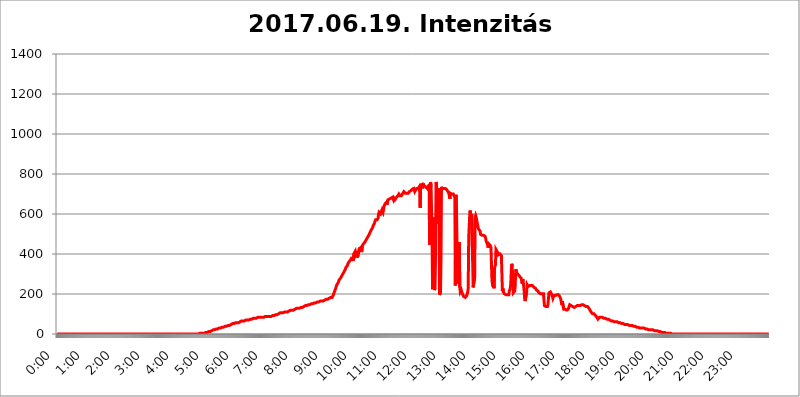
| Category | 2017.06.19. Intenzitás [W/m^2] |
|---|---|
| 0.0 | 0 |
| 0.0006944444444444445 | 0 |
| 0.001388888888888889 | 0 |
| 0.0020833333333333333 | 0 |
| 0.002777777777777778 | 0 |
| 0.003472222222222222 | 0 |
| 0.004166666666666667 | 0 |
| 0.004861111111111111 | 0 |
| 0.005555555555555556 | 0 |
| 0.0062499999999999995 | 0 |
| 0.006944444444444444 | 0 |
| 0.007638888888888889 | 0 |
| 0.008333333333333333 | 0 |
| 0.009027777777777779 | 0 |
| 0.009722222222222222 | 0 |
| 0.010416666666666666 | 0 |
| 0.011111111111111112 | 0 |
| 0.011805555555555555 | 0 |
| 0.012499999999999999 | 0 |
| 0.013194444444444444 | 0 |
| 0.013888888888888888 | 0 |
| 0.014583333333333332 | 0 |
| 0.015277777777777777 | 0 |
| 0.015972222222222224 | 0 |
| 0.016666666666666666 | 0 |
| 0.017361111111111112 | 0 |
| 0.018055555555555557 | 0 |
| 0.01875 | 0 |
| 0.019444444444444445 | 0 |
| 0.02013888888888889 | 0 |
| 0.020833333333333332 | 0 |
| 0.02152777777777778 | 0 |
| 0.022222222222222223 | 0 |
| 0.02291666666666667 | 0 |
| 0.02361111111111111 | 0 |
| 0.024305555555555556 | 0 |
| 0.024999999999999998 | 0 |
| 0.025694444444444447 | 0 |
| 0.02638888888888889 | 0 |
| 0.027083333333333334 | 0 |
| 0.027777777777777776 | 0 |
| 0.02847222222222222 | 0 |
| 0.029166666666666664 | 0 |
| 0.029861111111111113 | 0 |
| 0.030555555555555555 | 0 |
| 0.03125 | 0 |
| 0.03194444444444445 | 0 |
| 0.03263888888888889 | 0 |
| 0.03333333333333333 | 0 |
| 0.034027777777777775 | 0 |
| 0.034722222222222224 | 0 |
| 0.035416666666666666 | 0 |
| 0.036111111111111115 | 0 |
| 0.03680555555555556 | 0 |
| 0.0375 | 0 |
| 0.03819444444444444 | 0 |
| 0.03888888888888889 | 0 |
| 0.03958333333333333 | 0 |
| 0.04027777777777778 | 0 |
| 0.04097222222222222 | 0 |
| 0.041666666666666664 | 0 |
| 0.042361111111111106 | 0 |
| 0.04305555555555556 | 0 |
| 0.043750000000000004 | 0 |
| 0.044444444444444446 | 0 |
| 0.04513888888888889 | 0 |
| 0.04583333333333334 | 0 |
| 0.04652777777777778 | 0 |
| 0.04722222222222222 | 0 |
| 0.04791666666666666 | 0 |
| 0.04861111111111111 | 0 |
| 0.049305555555555554 | 0 |
| 0.049999999999999996 | 0 |
| 0.05069444444444445 | 0 |
| 0.051388888888888894 | 0 |
| 0.052083333333333336 | 0 |
| 0.05277777777777778 | 0 |
| 0.05347222222222222 | 0 |
| 0.05416666666666667 | 0 |
| 0.05486111111111111 | 0 |
| 0.05555555555555555 | 0 |
| 0.05625 | 0 |
| 0.05694444444444444 | 0 |
| 0.057638888888888885 | 0 |
| 0.05833333333333333 | 0 |
| 0.05902777777777778 | 0 |
| 0.059722222222222225 | 0 |
| 0.06041666666666667 | 0 |
| 0.061111111111111116 | 0 |
| 0.06180555555555556 | 0 |
| 0.0625 | 0 |
| 0.06319444444444444 | 0 |
| 0.06388888888888888 | 0 |
| 0.06458333333333334 | 0 |
| 0.06527777777777778 | 0 |
| 0.06597222222222222 | 0 |
| 0.06666666666666667 | 0 |
| 0.06736111111111111 | 0 |
| 0.06805555555555555 | 0 |
| 0.06874999999999999 | 0 |
| 0.06944444444444443 | 0 |
| 0.07013888888888889 | 0 |
| 0.07083333333333333 | 0 |
| 0.07152777777777779 | 0 |
| 0.07222222222222223 | 0 |
| 0.07291666666666667 | 0 |
| 0.07361111111111111 | 0 |
| 0.07430555555555556 | 0 |
| 0.075 | 0 |
| 0.07569444444444444 | 0 |
| 0.0763888888888889 | 0 |
| 0.07708333333333334 | 0 |
| 0.07777777777777778 | 0 |
| 0.07847222222222222 | 0 |
| 0.07916666666666666 | 0 |
| 0.0798611111111111 | 0 |
| 0.08055555555555556 | 0 |
| 0.08125 | 0 |
| 0.08194444444444444 | 0 |
| 0.08263888888888889 | 0 |
| 0.08333333333333333 | 0 |
| 0.08402777777777777 | 0 |
| 0.08472222222222221 | 0 |
| 0.08541666666666665 | 0 |
| 0.08611111111111112 | 0 |
| 0.08680555555555557 | 0 |
| 0.08750000000000001 | 0 |
| 0.08819444444444445 | 0 |
| 0.08888888888888889 | 0 |
| 0.08958333333333333 | 0 |
| 0.09027777777777778 | 0 |
| 0.09097222222222222 | 0 |
| 0.09166666666666667 | 0 |
| 0.09236111111111112 | 0 |
| 0.09305555555555556 | 0 |
| 0.09375 | 0 |
| 0.09444444444444444 | 0 |
| 0.09513888888888888 | 0 |
| 0.09583333333333333 | 0 |
| 0.09652777777777777 | 0 |
| 0.09722222222222222 | 0 |
| 0.09791666666666667 | 0 |
| 0.09861111111111111 | 0 |
| 0.09930555555555555 | 0 |
| 0.09999999999999999 | 0 |
| 0.10069444444444443 | 0 |
| 0.1013888888888889 | 0 |
| 0.10208333333333335 | 0 |
| 0.10277777777777779 | 0 |
| 0.10347222222222223 | 0 |
| 0.10416666666666667 | 0 |
| 0.10486111111111111 | 0 |
| 0.10555555555555556 | 0 |
| 0.10625 | 0 |
| 0.10694444444444444 | 0 |
| 0.1076388888888889 | 0 |
| 0.10833333333333334 | 0 |
| 0.10902777777777778 | 0 |
| 0.10972222222222222 | 0 |
| 0.1111111111111111 | 0 |
| 0.11180555555555556 | 0 |
| 0.11180555555555556 | 0 |
| 0.1125 | 0 |
| 0.11319444444444444 | 0 |
| 0.11388888888888889 | 0 |
| 0.11458333333333333 | 0 |
| 0.11527777777777777 | 0 |
| 0.11597222222222221 | 0 |
| 0.11666666666666665 | 0 |
| 0.1173611111111111 | 0 |
| 0.11805555555555557 | 0 |
| 0.11944444444444445 | 0 |
| 0.12013888888888889 | 0 |
| 0.12083333333333333 | 0 |
| 0.12152777777777778 | 0 |
| 0.12222222222222223 | 0 |
| 0.12291666666666667 | 0 |
| 0.12291666666666667 | 0 |
| 0.12361111111111112 | 0 |
| 0.12430555555555556 | 0 |
| 0.125 | 0 |
| 0.12569444444444444 | 0 |
| 0.12638888888888888 | 0 |
| 0.12708333333333333 | 0 |
| 0.16875 | 0 |
| 0.12847222222222224 | 0 |
| 0.12916666666666668 | 0 |
| 0.12986111111111112 | 0 |
| 0.13055555555555556 | 0 |
| 0.13125 | 0 |
| 0.13194444444444445 | 0 |
| 0.1326388888888889 | 0 |
| 0.13333333333333333 | 0 |
| 0.13402777777777777 | 0 |
| 0.13402777777777777 | 0 |
| 0.13472222222222222 | 0 |
| 0.13541666666666666 | 0 |
| 0.1361111111111111 | 0 |
| 0.13749999999999998 | 0 |
| 0.13819444444444443 | 0 |
| 0.1388888888888889 | 0 |
| 0.13958333333333334 | 0 |
| 0.14027777777777778 | 0 |
| 0.14097222222222222 | 0 |
| 0.14166666666666666 | 0 |
| 0.1423611111111111 | 0 |
| 0.14305555555555557 | 0 |
| 0.14375000000000002 | 0 |
| 0.14444444444444446 | 0 |
| 0.1451388888888889 | 0 |
| 0.1451388888888889 | 0 |
| 0.14652777777777778 | 0 |
| 0.14722222222222223 | 0 |
| 0.14791666666666667 | 0 |
| 0.1486111111111111 | 0 |
| 0.14930555555555555 | 0 |
| 0.15 | 0 |
| 0.15069444444444444 | 0 |
| 0.15138888888888888 | 0 |
| 0.15208333333333332 | 0 |
| 0.15277777777777776 | 0 |
| 0.15347222222222223 | 0 |
| 0.15416666666666667 | 0 |
| 0.15486111111111112 | 0 |
| 0.15555555555555556 | 0 |
| 0.15625 | 0 |
| 0.15694444444444444 | 0 |
| 0.15763888888888888 | 0 |
| 0.15833333333333333 | 0 |
| 0.15902777777777777 | 0 |
| 0.15972222222222224 | 0 |
| 0.16041666666666668 | 0 |
| 0.16111111111111112 | 0 |
| 0.16180555555555556 | 0 |
| 0.1625 | 0 |
| 0.16319444444444445 | 0 |
| 0.1638888888888889 | 0 |
| 0.16458333333333333 | 0 |
| 0.16527777777777777 | 0 |
| 0.16597222222222222 | 0 |
| 0.16666666666666666 | 0 |
| 0.1673611111111111 | 0 |
| 0.16805555555555554 | 0 |
| 0.16874999999999998 | 0 |
| 0.16944444444444443 | 0 |
| 0.17013888888888887 | 0 |
| 0.1708333333333333 | 0 |
| 0.17152777777777775 | 0 |
| 0.17222222222222225 | 0 |
| 0.1729166666666667 | 0 |
| 0.17361111111111113 | 0 |
| 0.17430555555555557 | 0 |
| 0.17500000000000002 | 0 |
| 0.17569444444444446 | 0 |
| 0.1763888888888889 | 0 |
| 0.17708333333333334 | 0 |
| 0.17777777777777778 | 0 |
| 0.17847222222222223 | 0 |
| 0.17916666666666667 | 0 |
| 0.1798611111111111 | 0 |
| 0.18055555555555555 | 0 |
| 0.18125 | 0 |
| 0.18194444444444444 | 0 |
| 0.1826388888888889 | 0 |
| 0.18333333333333335 | 0 |
| 0.1840277777777778 | 0 |
| 0.18472222222222223 | 0 |
| 0.18541666666666667 | 0 |
| 0.18611111111111112 | 0 |
| 0.18680555555555556 | 0 |
| 0.1875 | 0 |
| 0.18819444444444444 | 0 |
| 0.18888888888888888 | 0 |
| 0.18958333333333333 | 0 |
| 0.19027777777777777 | 0 |
| 0.1909722222222222 | 0 |
| 0.19166666666666665 | 0 |
| 0.19236111111111112 | 0 |
| 0.19305555555555554 | 0 |
| 0.19375 | 0 |
| 0.19444444444444445 | 0 |
| 0.1951388888888889 | 0 |
| 0.19583333333333333 | 0 |
| 0.19652777777777777 | 0 |
| 0.19722222222222222 | 0 |
| 0.19791666666666666 | 0 |
| 0.1986111111111111 | 0 |
| 0.19930555555555554 | 3.525 |
| 0.19999999999999998 | 3.525 |
| 0.20069444444444443 | 3.525 |
| 0.20138888888888887 | 3.525 |
| 0.2020833333333333 | 3.525 |
| 0.2027777777777778 | 3.525 |
| 0.2034722222222222 | 3.525 |
| 0.2041666666666667 | 3.525 |
| 0.20486111111111113 | 3.525 |
| 0.20555555555555557 | 3.525 |
| 0.20625000000000002 | 3.525 |
| 0.20694444444444446 | 3.525 |
| 0.2076388888888889 | 7.887 |
| 0.20833333333333334 | 7.887 |
| 0.20902777777777778 | 7.887 |
| 0.20972222222222223 | 7.887 |
| 0.21041666666666667 | 7.887 |
| 0.2111111111111111 | 7.887 |
| 0.21180555555555555 | 7.887 |
| 0.2125 | 12.257 |
| 0.21319444444444444 | 12.257 |
| 0.2138888888888889 | 12.257 |
| 0.21458333333333335 | 12.257 |
| 0.2152777777777778 | 16.636 |
| 0.21597222222222223 | 16.636 |
| 0.21666666666666667 | 16.636 |
| 0.21736111111111112 | 16.636 |
| 0.21805555555555556 | 21.024 |
| 0.21875 | 21.024 |
| 0.21944444444444444 | 21.024 |
| 0.22013888888888888 | 21.024 |
| 0.22083333333333333 | 21.024 |
| 0.22152777777777777 | 21.024 |
| 0.2222222222222222 | 21.024 |
| 0.22291666666666665 | 25.419 |
| 0.2236111111111111 | 25.419 |
| 0.22430555555555556 | 25.419 |
| 0.225 | 25.419 |
| 0.22569444444444445 | 29.823 |
| 0.2263888888888889 | 29.823 |
| 0.22708333333333333 | 29.823 |
| 0.22777777777777777 | 29.823 |
| 0.22847222222222222 | 29.823 |
| 0.22916666666666666 | 29.823 |
| 0.2298611111111111 | 29.823 |
| 0.23055555555555554 | 29.823 |
| 0.23124999999999998 | 34.234 |
| 0.23194444444444443 | 34.234 |
| 0.23263888888888887 | 34.234 |
| 0.2333333333333333 | 34.234 |
| 0.2340277777777778 | 34.234 |
| 0.2347222222222222 | 38.653 |
| 0.2354166666666667 | 38.653 |
| 0.23611111111111113 | 38.653 |
| 0.23680555555555557 | 38.653 |
| 0.23750000000000002 | 38.653 |
| 0.23819444444444446 | 38.653 |
| 0.2388888888888889 | 43.079 |
| 0.23958333333333334 | 43.079 |
| 0.24027777777777778 | 43.079 |
| 0.24097222222222223 | 43.079 |
| 0.24166666666666667 | 43.079 |
| 0.2423611111111111 | 47.511 |
| 0.24305555555555555 | 47.511 |
| 0.24375 | 47.511 |
| 0.24444444444444446 | 47.511 |
| 0.24513888888888888 | 47.511 |
| 0.24583333333333335 | 51.951 |
| 0.2465277777777778 | 51.951 |
| 0.24722222222222223 | 51.951 |
| 0.24791666666666667 | 51.951 |
| 0.24861111111111112 | 51.951 |
| 0.24930555555555556 | 56.398 |
| 0.25 | 56.398 |
| 0.25069444444444444 | 56.398 |
| 0.2513888888888889 | 56.398 |
| 0.2520833333333333 | 56.398 |
| 0.25277777777777777 | 56.398 |
| 0.2534722222222222 | 56.398 |
| 0.25416666666666665 | 56.398 |
| 0.2548611111111111 | 60.85 |
| 0.2555555555555556 | 60.85 |
| 0.25625000000000003 | 60.85 |
| 0.2569444444444445 | 60.85 |
| 0.2576388888888889 | 60.85 |
| 0.25833333333333336 | 65.31 |
| 0.2590277777777778 | 65.31 |
| 0.25972222222222224 | 65.31 |
| 0.2604166666666667 | 65.31 |
| 0.2611111111111111 | 65.31 |
| 0.26180555555555557 | 65.31 |
| 0.2625 | 65.31 |
| 0.26319444444444445 | 65.31 |
| 0.2638888888888889 | 69.775 |
| 0.26458333333333334 | 69.775 |
| 0.2652777777777778 | 69.775 |
| 0.2659722222222222 | 69.775 |
| 0.26666666666666666 | 69.775 |
| 0.2673611111111111 | 69.775 |
| 0.26805555555555555 | 69.775 |
| 0.26875 | 69.775 |
| 0.26944444444444443 | 69.775 |
| 0.2701388888888889 | 74.246 |
| 0.2708333333333333 | 74.246 |
| 0.27152777777777776 | 74.246 |
| 0.2722222222222222 | 74.246 |
| 0.27291666666666664 | 74.246 |
| 0.2736111111111111 | 74.246 |
| 0.2743055555555555 | 74.246 |
| 0.27499999999999997 | 78.722 |
| 0.27569444444444446 | 78.722 |
| 0.27638888888888885 | 78.722 |
| 0.27708333333333335 | 78.722 |
| 0.2777777777777778 | 78.722 |
| 0.27847222222222223 | 78.722 |
| 0.2791666666666667 | 78.722 |
| 0.2798611111111111 | 78.722 |
| 0.28055555555555556 | 83.205 |
| 0.28125 | 83.205 |
| 0.28194444444444444 | 83.205 |
| 0.2826388888888889 | 83.205 |
| 0.2833333333333333 | 83.205 |
| 0.28402777777777777 | 83.205 |
| 0.2847222222222222 | 83.205 |
| 0.28541666666666665 | 83.205 |
| 0.28611111111111115 | 83.205 |
| 0.28680555555555554 | 83.205 |
| 0.28750000000000003 | 83.205 |
| 0.2881944444444445 | 83.205 |
| 0.2888888888888889 | 83.205 |
| 0.28958333333333336 | 83.205 |
| 0.2902777777777778 | 87.692 |
| 0.29097222222222224 | 87.692 |
| 0.2916666666666667 | 87.692 |
| 0.2923611111111111 | 87.692 |
| 0.29305555555555557 | 87.692 |
| 0.29375 | 87.692 |
| 0.29444444444444445 | 87.692 |
| 0.2951388888888889 | 87.692 |
| 0.29583333333333334 | 87.692 |
| 0.2965277777777778 | 87.692 |
| 0.2972222222222222 | 87.692 |
| 0.29791666666666666 | 87.692 |
| 0.2986111111111111 | 87.692 |
| 0.29930555555555555 | 87.692 |
| 0.3 | 87.692 |
| 0.30069444444444443 | 87.692 |
| 0.3013888888888889 | 92.184 |
| 0.3020833333333333 | 92.184 |
| 0.30277777777777776 | 92.184 |
| 0.3034722222222222 | 92.184 |
| 0.30416666666666664 | 92.184 |
| 0.3048611111111111 | 96.682 |
| 0.3055555555555555 | 96.682 |
| 0.30624999999999997 | 96.682 |
| 0.3069444444444444 | 96.682 |
| 0.3076388888888889 | 96.682 |
| 0.30833333333333335 | 96.682 |
| 0.3090277777777778 | 101.184 |
| 0.30972222222222223 | 101.184 |
| 0.3104166666666667 | 101.184 |
| 0.3111111111111111 | 101.184 |
| 0.31180555555555556 | 101.184 |
| 0.3125 | 105.69 |
| 0.31319444444444444 | 105.69 |
| 0.3138888888888889 | 101.184 |
| 0.3145833333333333 | 105.69 |
| 0.31527777777777777 | 105.69 |
| 0.3159722222222222 | 105.69 |
| 0.31666666666666665 | 105.69 |
| 0.31736111111111115 | 110.201 |
| 0.31805555555555554 | 110.201 |
| 0.31875000000000003 | 110.201 |
| 0.3194444444444445 | 110.201 |
| 0.3201388888888889 | 110.201 |
| 0.32083333333333336 | 110.201 |
| 0.3215277777777778 | 110.201 |
| 0.32222222222222224 | 110.201 |
| 0.3229166666666667 | 110.201 |
| 0.3236111111111111 | 110.201 |
| 0.32430555555555557 | 114.716 |
| 0.325 | 114.716 |
| 0.32569444444444445 | 114.716 |
| 0.3263888888888889 | 114.716 |
| 0.32708333333333334 | 119.235 |
| 0.3277777777777778 | 119.235 |
| 0.3284722222222222 | 119.235 |
| 0.32916666666666666 | 119.235 |
| 0.3298611111111111 | 119.235 |
| 0.33055555555555555 | 119.235 |
| 0.33125 | 119.235 |
| 0.33194444444444443 | 123.758 |
| 0.3326388888888889 | 123.758 |
| 0.3333333333333333 | 123.758 |
| 0.3340277777777778 | 123.758 |
| 0.3347222222222222 | 123.758 |
| 0.3354166666666667 | 128.284 |
| 0.3361111111111111 | 128.284 |
| 0.3368055555555556 | 128.284 |
| 0.33749999999999997 | 128.284 |
| 0.33819444444444446 | 128.284 |
| 0.33888888888888885 | 128.284 |
| 0.33958333333333335 | 128.284 |
| 0.34027777777777773 | 132.814 |
| 0.34097222222222223 | 132.814 |
| 0.3416666666666666 | 132.814 |
| 0.3423611111111111 | 132.814 |
| 0.3430555555555555 | 132.814 |
| 0.34375 | 132.814 |
| 0.3444444444444445 | 137.347 |
| 0.3451388888888889 | 137.347 |
| 0.3458333333333334 | 137.347 |
| 0.34652777777777777 | 137.347 |
| 0.34722222222222227 | 137.347 |
| 0.34791666666666665 | 141.884 |
| 0.34861111111111115 | 141.884 |
| 0.34930555555555554 | 141.884 |
| 0.35000000000000003 | 141.884 |
| 0.3506944444444444 | 141.884 |
| 0.3513888888888889 | 146.423 |
| 0.3520833333333333 | 146.423 |
| 0.3527777777777778 | 146.423 |
| 0.3534722222222222 | 146.423 |
| 0.3541666666666667 | 146.423 |
| 0.3548611111111111 | 146.423 |
| 0.35555555555555557 | 146.423 |
| 0.35625 | 150.964 |
| 0.35694444444444445 | 150.964 |
| 0.3576388888888889 | 150.964 |
| 0.35833333333333334 | 150.964 |
| 0.3590277777777778 | 155.509 |
| 0.3597222222222222 | 155.509 |
| 0.36041666666666666 | 155.509 |
| 0.3611111111111111 | 155.509 |
| 0.36180555555555555 | 155.509 |
| 0.3625 | 155.509 |
| 0.36319444444444443 | 155.509 |
| 0.3638888888888889 | 160.056 |
| 0.3645833333333333 | 160.056 |
| 0.3652777777777778 | 160.056 |
| 0.3659722222222222 | 160.056 |
| 0.3666666666666667 | 160.056 |
| 0.3673611111111111 | 155.509 |
| 0.3680555555555556 | 164.605 |
| 0.36874999999999997 | 164.605 |
| 0.36944444444444446 | 164.605 |
| 0.37013888888888885 | 164.605 |
| 0.37083333333333335 | 164.605 |
| 0.37152777777777773 | 164.605 |
| 0.37222222222222223 | 169.156 |
| 0.3729166666666666 | 164.605 |
| 0.3736111111111111 | 164.605 |
| 0.3743055555555555 | 169.156 |
| 0.375 | 169.156 |
| 0.3756944444444445 | 173.709 |
| 0.3763888888888889 | 173.709 |
| 0.3770833333333334 | 173.709 |
| 0.37777777777777777 | 173.709 |
| 0.37847222222222227 | 173.709 |
| 0.37916666666666665 | 173.709 |
| 0.37986111111111115 | 173.709 |
| 0.38055555555555554 | 178.264 |
| 0.38125000000000003 | 178.264 |
| 0.3819444444444444 | 178.264 |
| 0.3826388888888889 | 178.264 |
| 0.3833333333333333 | 182.82 |
| 0.3840277777777778 | 182.82 |
| 0.3847222222222222 | 182.82 |
| 0.3854166666666667 | 182.82 |
| 0.3861111111111111 | 187.378 |
| 0.38680555555555557 | 191.937 |
| 0.3875 | 196.497 |
| 0.38819444444444445 | 205.62 |
| 0.3888888888888889 | 210.182 |
| 0.38958333333333334 | 219.309 |
| 0.3902777777777778 | 223.873 |
| 0.3909722222222222 | 233 |
| 0.39166666666666666 | 242.127 |
| 0.3923611111111111 | 246.689 |
| 0.39305555555555555 | 251.251 |
| 0.39375 | 255.813 |
| 0.39444444444444443 | 260.373 |
| 0.3951388888888889 | 269.49 |
| 0.3958333333333333 | 269.49 |
| 0.3965277777777778 | 274.047 |
| 0.3972222222222222 | 278.603 |
| 0.3979166666666667 | 283.156 |
| 0.3986111111111111 | 287.709 |
| 0.3993055555555556 | 292.259 |
| 0.39999999999999997 | 296.808 |
| 0.40069444444444446 | 301.354 |
| 0.40138888888888885 | 305.898 |
| 0.40208333333333335 | 310.44 |
| 0.40277777777777773 | 314.98 |
| 0.40347222222222223 | 319.517 |
| 0.4041666666666666 | 324.052 |
| 0.4048611111111111 | 333.113 |
| 0.4055555555555555 | 333.113 |
| 0.40625 | 337.639 |
| 0.4069444444444445 | 342.162 |
| 0.4076388888888889 | 351.198 |
| 0.4083333333333334 | 351.198 |
| 0.40902777777777777 | 360.221 |
| 0.40972222222222227 | 360.221 |
| 0.41041666666666665 | 364.728 |
| 0.41111111111111115 | 369.23 |
| 0.41180555555555554 | 373.729 |
| 0.41250000000000003 | 378.224 |
| 0.4131944444444444 | 378.224 |
| 0.4138888888888889 | 382.715 |
| 0.4145833333333333 | 373.729 |
| 0.4152777777777778 | 364.728 |
| 0.4159722222222222 | 400.638 |
| 0.4166666666666667 | 400.638 |
| 0.4173611111111111 | 405.108 |
| 0.41805555555555557 | 414.035 |
| 0.41875 | 400.638 |
| 0.41944444444444445 | 405.108 |
| 0.4201388888888889 | 414.035 |
| 0.42083333333333334 | 382.715 |
| 0.4215277777777778 | 382.715 |
| 0.4222222222222222 | 396.164 |
| 0.42291666666666666 | 418.492 |
| 0.4236111111111111 | 427.39 |
| 0.42430555555555555 | 431.833 |
| 0.425 | 431.833 |
| 0.42569444444444443 | 431.833 |
| 0.4263888888888889 | 418.492 |
| 0.4270833333333333 | 409.574 |
| 0.4277777777777778 | 440.702 |
| 0.4284722222222222 | 445.129 |
| 0.4291666666666667 | 449.551 |
| 0.4298611111111111 | 453.968 |
| 0.4305555555555556 | 453.968 |
| 0.43124999999999997 | 458.38 |
| 0.43194444444444446 | 458.38 |
| 0.43263888888888885 | 467.187 |
| 0.43333333333333335 | 471.582 |
| 0.43402777777777773 | 475.972 |
| 0.43472222222222223 | 480.356 |
| 0.4354166666666666 | 484.735 |
| 0.4361111111111111 | 489.108 |
| 0.4368055555555555 | 489.108 |
| 0.4375 | 497.836 |
| 0.4381944444444445 | 502.192 |
| 0.4388888888888889 | 502.192 |
| 0.4395833333333334 | 515.223 |
| 0.44027777777777777 | 519.555 |
| 0.44097222222222227 | 523.88 |
| 0.44166666666666665 | 528.2 |
| 0.44236111111111115 | 532.513 |
| 0.44305555555555554 | 541.121 |
| 0.44375000000000003 | 545.416 |
| 0.4444444444444444 | 549.704 |
| 0.4451388888888889 | 558.261 |
| 0.4458333333333333 | 562.53 |
| 0.4465277777777778 | 571.049 |
| 0.4472222222222222 | 575.299 |
| 0.4479166666666667 | 571.049 |
| 0.4486111111111111 | 571.049 |
| 0.44930555555555557 | 575.299 |
| 0.45 | 579.542 |
| 0.45069444444444445 | 600.661 |
| 0.4513888888888889 | 609.062 |
| 0.45208333333333334 | 609.062 |
| 0.4527777777777778 | 604.864 |
| 0.4534722222222222 | 600.661 |
| 0.45416666666666666 | 609.062 |
| 0.4548611111111111 | 613.252 |
| 0.45555555555555555 | 621.613 |
| 0.45625 | 617.436 |
| 0.45694444444444443 | 609.062 |
| 0.4576388888888889 | 621.613 |
| 0.4583333333333333 | 638.256 |
| 0.4590277777777778 | 642.4 |
| 0.4597222222222222 | 650.667 |
| 0.4604166666666667 | 646.537 |
| 0.4611111111111111 | 646.537 |
| 0.4618055555555556 | 658.909 |
| 0.46249999999999997 | 646.537 |
| 0.46319444444444446 | 658.909 |
| 0.46388888888888885 | 671.22 |
| 0.46458333333333335 | 675.311 |
| 0.46527777777777773 | 675.311 |
| 0.46597222222222223 | 675.311 |
| 0.4666666666666666 | 671.22 |
| 0.4673611111111111 | 675.311 |
| 0.4680555555555555 | 679.395 |
| 0.46875 | 679.395 |
| 0.4694444444444445 | 683.473 |
| 0.4701388888888889 | 683.473 |
| 0.4708333333333334 | 683.473 |
| 0.47152777777777777 | 671.22 |
| 0.47222222222222227 | 679.395 |
| 0.47291666666666665 | 675.311 |
| 0.47361111111111115 | 671.22 |
| 0.47430555555555554 | 675.311 |
| 0.47500000000000003 | 675.311 |
| 0.4756944444444444 | 683.473 |
| 0.4763888888888889 | 683.473 |
| 0.4770833333333333 | 687.544 |
| 0.4777777777777778 | 691.608 |
| 0.4784722222222222 | 695.666 |
| 0.4791666666666667 | 699.717 |
| 0.4798611111111111 | 695.666 |
| 0.48055555555555557 | 691.608 |
| 0.48125 | 691.608 |
| 0.48194444444444445 | 687.544 |
| 0.4826388888888889 | 691.608 |
| 0.48333333333333334 | 695.666 |
| 0.4840277777777778 | 699.717 |
| 0.4847222222222222 | 699.717 |
| 0.48541666666666666 | 699.717 |
| 0.4861111111111111 | 711.832 |
| 0.48680555555555555 | 707.8 |
| 0.4875 | 707.8 |
| 0.48819444444444443 | 703.762 |
| 0.4888888888888889 | 703.762 |
| 0.4895833333333333 | 707.8 |
| 0.4902777777777778 | 703.762 |
| 0.4909722222222222 | 707.8 |
| 0.4916666666666667 | 703.762 |
| 0.4923611111111111 | 703.762 |
| 0.4930555555555556 | 707.8 |
| 0.49374999999999997 | 711.832 |
| 0.49444444444444446 | 711.832 |
| 0.49513888888888885 | 711.832 |
| 0.49583333333333335 | 715.858 |
| 0.49652777777777773 | 719.877 |
| 0.49722222222222223 | 719.877 |
| 0.4979166666666666 | 723.889 |
| 0.4986111111111111 | 727.896 |
| 0.4993055555555555 | 727.896 |
| 0.5 | 727.896 |
| 0.5006944444444444 | 719.877 |
| 0.5013888888888889 | 711.832 |
| 0.5020833333333333 | 715.858 |
| 0.5027777777777778 | 719.877 |
| 0.5034722222222222 | 723.889 |
| 0.5041666666666667 | 727.896 |
| 0.5048611111111111 | 723.889 |
| 0.5055555555555555 | 727.896 |
| 0.50625 | 727.896 |
| 0.5069444444444444 | 723.889 |
| 0.5076388888888889 | 735.89 |
| 0.5083333333333333 | 707.8 |
| 0.5090277777777777 | 629.948 |
| 0.5097222222222222 | 743.859 |
| 0.5104166666666666 | 747.834 |
| 0.5111111111111112 | 743.859 |
| 0.5118055555555555 | 747.834 |
| 0.5125000000000001 | 727.896 |
| 0.5131944444444444 | 751.803 |
| 0.513888888888889 | 747.834 |
| 0.5145833333333333 | 739.877 |
| 0.5152777777777778 | 735.89 |
| 0.5159722222222222 | 735.89 |
| 0.5166666666666667 | 735.89 |
| 0.517361111111111 | 735.89 |
| 0.5180555555555556 | 731.896 |
| 0.5187499999999999 | 727.896 |
| 0.5194444444444445 | 735.89 |
| 0.5201388888888888 | 739.877 |
| 0.5208333333333334 | 739.877 |
| 0.5215277777777778 | 743.859 |
| 0.5222222222222223 | 445.129 |
| 0.5229166666666667 | 497.836 |
| 0.5236111111111111 | 759.723 |
| 0.5243055555555556 | 739.877 |
| 0.525 | 743.859 |
| 0.5256944444444445 | 480.356 |
| 0.5263888888888889 | 223.873 |
| 0.5270833333333333 | 427.39 |
| 0.5277777777777778 | 583.779 |
| 0.5284722222222222 | 246.689 |
| 0.5291666666666667 | 219.309 |
| 0.5298611111111111 | 228.436 |
| 0.5305555555555556 | 391.685 |
| 0.53125 | 759.723 |
| 0.5319444444444444 | 751.803 |
| 0.5326388888888889 | 747.834 |
| 0.5333333333333333 | 549.704 |
| 0.5340277777777778 | 727.896 |
| 0.5347222222222222 | 727.896 |
| 0.5354166666666667 | 711.832 |
| 0.5361111111111111 | 196.497 |
| 0.5368055555555555 | 191.937 |
| 0.5375 | 205.62 |
| 0.5381944444444444 | 369.23 |
| 0.5388888888888889 | 735.89 |
| 0.5395833333333333 | 723.889 |
| 0.5402777777777777 | 727.896 |
| 0.5409722222222222 | 727.896 |
| 0.5416666666666666 | 727.896 |
| 0.5423611111111112 | 727.896 |
| 0.5430555555555555 | 727.896 |
| 0.5437500000000001 | 727.896 |
| 0.5444444444444444 | 727.896 |
| 0.545138888888889 | 723.889 |
| 0.5458333333333333 | 723.889 |
| 0.5465277777777778 | 723.889 |
| 0.5472222222222222 | 719.877 |
| 0.5479166666666667 | 711.832 |
| 0.548611111111111 | 707.8 |
| 0.5493055555555556 | 703.762 |
| 0.5499999999999999 | 703.762 |
| 0.5506944444444445 | 675.311 |
| 0.5513888888888888 | 703.762 |
| 0.5520833333333334 | 707.8 |
| 0.5527777777777778 | 699.717 |
| 0.5534722222222223 | 699.717 |
| 0.5541666666666667 | 699.717 |
| 0.5548611111111111 | 695.666 |
| 0.5555555555555556 | 699.717 |
| 0.55625 | 695.666 |
| 0.5569444444444445 | 695.666 |
| 0.5576388888888889 | 683.473 |
| 0.5583333333333333 | 242.127 |
| 0.5590277777777778 | 695.666 |
| 0.5597222222222222 | 687.544 |
| 0.5604166666666667 | 691.608 |
| 0.5611111111111111 | 346.682 |
| 0.5618055555555556 | 387.202 |
| 0.5625 | 414.035 |
| 0.5631944444444444 | 251.251 |
| 0.5638888888888889 | 458.38 |
| 0.5645833333333333 | 233 |
| 0.5652777777777778 | 210.182 |
| 0.5659722222222222 | 214.746 |
| 0.5666666666666667 | 219.309 |
| 0.5673611111111111 | 210.182 |
| 0.5680555555555555 | 205.62 |
| 0.56875 | 196.497 |
| 0.5694444444444444 | 191.937 |
| 0.5701388888888889 | 187.378 |
| 0.5708333333333333 | 182.82 |
| 0.5715277777777777 | 182.82 |
| 0.5722222222222222 | 182.82 |
| 0.5729166666666666 | 182.82 |
| 0.5736111111111112 | 187.378 |
| 0.5743055555555555 | 191.937 |
| 0.5750000000000001 | 196.497 |
| 0.5756944444444444 | 210.182 |
| 0.576388888888889 | 228.436 |
| 0.5770833333333333 | 480.356 |
| 0.5777777777777778 | 484.735 |
| 0.5784722222222222 | 592.233 |
| 0.5791666666666667 | 617.436 |
| 0.579861111111111 | 621.613 |
| 0.5805555555555556 | 549.704 |
| 0.5812499999999999 | 600.661 |
| 0.5819444444444445 | 600.661 |
| 0.5826388888888888 | 364.728 |
| 0.5833333333333334 | 233 |
| 0.5840277777777778 | 237.564 |
| 0.5847222222222223 | 233 |
| 0.5854166666666667 | 283.156 |
| 0.5861111111111111 | 583.779 |
| 0.5868055555555556 | 592.233 |
| 0.5875 | 583.779 |
| 0.5881944444444445 | 571.049 |
| 0.5888888888888889 | 558.261 |
| 0.5895833333333333 | 545.416 |
| 0.5902777777777778 | 532.513 |
| 0.5909722222222222 | 523.88 |
| 0.5916666666666667 | 523.88 |
| 0.5923611111111111 | 519.555 |
| 0.5930555555555556 | 515.223 |
| 0.59375 | 497.836 |
| 0.5944444444444444 | 497.836 |
| 0.5951388888888889 | 497.836 |
| 0.5958333333333333 | 493.475 |
| 0.5965277777777778 | 497.836 |
| 0.5972222222222222 | 497.836 |
| 0.5979166666666667 | 493.475 |
| 0.5986111111111111 | 493.475 |
| 0.5993055555555555 | 489.108 |
| 0.6 | 489.108 |
| 0.6006944444444444 | 480.356 |
| 0.6013888888888889 | 467.187 |
| 0.6020833333333333 | 458.38 |
| 0.6027777777777777 | 453.968 |
| 0.6034722222222222 | 449.551 |
| 0.6041666666666666 | 431.833 |
| 0.6048611111111112 | 440.702 |
| 0.6055555555555555 | 449.551 |
| 0.6062500000000001 | 449.551 |
| 0.6069444444444444 | 445.129 |
| 0.607638888888889 | 440.702 |
| 0.6083333333333333 | 431.833 |
| 0.6090277777777778 | 427.39 |
| 0.6097222222222222 | 264.932 |
| 0.6104166666666667 | 260.373 |
| 0.611111111111111 | 237.564 |
| 0.6118055555555556 | 278.603 |
| 0.6124999999999999 | 228.436 |
| 0.6131944444444445 | 328.584 |
| 0.6138888888888888 | 337.639 |
| 0.6145833333333334 | 346.682 |
| 0.6152777777777778 | 422.943 |
| 0.6159722222222223 | 418.492 |
| 0.6166666666666667 | 414.035 |
| 0.6173611111111111 | 409.574 |
| 0.6180555555555556 | 405.108 |
| 0.61875 | 396.164 |
| 0.6194444444444445 | 391.685 |
| 0.6201388888888889 | 396.164 |
| 0.6208333333333333 | 400.638 |
| 0.6215277777777778 | 400.638 |
| 0.6222222222222222 | 400.638 |
| 0.6229166666666667 | 391.685 |
| 0.6236111111111111 | 387.202 |
| 0.6243055555555556 | 214.746 |
| 0.625 | 228.436 |
| 0.6256944444444444 | 210.182 |
| 0.6263888888888889 | 205.62 |
| 0.6270833333333333 | 201.058 |
| 0.6277777777777778 | 196.497 |
| 0.6284722222222222 | 196.497 |
| 0.6291666666666667 | 196.497 |
| 0.6298611111111111 | 196.497 |
| 0.6305555555555555 | 196.497 |
| 0.63125 | 196.497 |
| 0.6319444444444444 | 196.497 |
| 0.6326388888888889 | 196.497 |
| 0.6333333333333333 | 196.497 |
| 0.6340277777777777 | 214.746 |
| 0.6347222222222222 | 214.746 |
| 0.6354166666666666 | 228.436 |
| 0.6361111111111112 | 255.813 |
| 0.6368055555555555 | 314.98 |
| 0.6375000000000001 | 351.198 |
| 0.6381944444444444 | 337.639 |
| 0.638888888888889 | 242.127 |
| 0.6395833333333333 | 205.62 |
| 0.6402777777777778 | 210.182 |
| 0.6409722222222222 | 210.182 |
| 0.6416666666666667 | 214.746 |
| 0.642361111111111 | 246.689 |
| 0.6430555555555556 | 324.052 |
| 0.6437499999999999 | 324.052 |
| 0.6444444444444445 | 305.898 |
| 0.6451388888888888 | 305.898 |
| 0.6458333333333334 | 301.354 |
| 0.6465277777777778 | 296.808 |
| 0.6472222222222223 | 296.808 |
| 0.6479166666666667 | 292.259 |
| 0.6486111111111111 | 287.709 |
| 0.6493055555555556 | 287.709 |
| 0.65 | 283.156 |
| 0.6506944444444445 | 278.603 |
| 0.6513888888888889 | 278.603 |
| 0.6520833333333333 | 251.251 |
| 0.6527777777777778 | 274.047 |
| 0.6534722222222222 | 264.932 |
| 0.6541666666666667 | 260.373 |
| 0.6548611111111111 | 214.746 |
| 0.6555555555555556 | 178.264 |
| 0.65625 | 164.605 |
| 0.6569444444444444 | 169.156 |
| 0.6576388888888889 | 169.156 |
| 0.6583333333333333 | 210.182 |
| 0.6590277777777778 | 246.689 |
| 0.6597222222222222 | 242.127 |
| 0.6604166666666667 | 237.564 |
| 0.6611111111111111 | 237.564 |
| 0.6618055555555555 | 242.127 |
| 0.6625 | 242.127 |
| 0.6631944444444444 | 242.127 |
| 0.6638888888888889 | 242.127 |
| 0.6645833333333333 | 242.127 |
| 0.6652777777777777 | 242.127 |
| 0.6659722222222222 | 242.127 |
| 0.6666666666666666 | 242.127 |
| 0.6673611111111111 | 237.564 |
| 0.6680555555555556 | 237.564 |
| 0.6687500000000001 | 233 |
| 0.6694444444444444 | 228.436 |
| 0.6701388888888888 | 228.436 |
| 0.6708333333333334 | 228.436 |
| 0.6715277777777778 | 223.873 |
| 0.6722222222222222 | 219.309 |
| 0.6729166666666666 | 219.309 |
| 0.6736111111111112 | 219.309 |
| 0.6743055555555556 | 214.746 |
| 0.6749999999999999 | 210.182 |
| 0.6756944444444444 | 205.62 |
| 0.6763888888888889 | 201.058 |
| 0.6770833333333334 | 201.058 |
| 0.6777777777777777 | 201.058 |
| 0.6784722222222223 | 201.058 |
| 0.6791666666666667 | 205.62 |
| 0.6798611111111111 | 201.058 |
| 0.6805555555555555 | 201.058 |
| 0.68125 | 201.058 |
| 0.6819444444444445 | 201.058 |
| 0.6826388888888889 | 196.497 |
| 0.6833333333333332 | 141.884 |
| 0.6840277777777778 | 137.347 |
| 0.6847222222222222 | 137.347 |
| 0.6854166666666667 | 137.347 |
| 0.686111111111111 | 137.347 |
| 0.6868055555555556 | 137.347 |
| 0.6875 | 137.347 |
| 0.6881944444444444 | 146.423 |
| 0.688888888888889 | 173.709 |
| 0.6895833333333333 | 205.62 |
| 0.6902777777777778 | 205.62 |
| 0.6909722222222222 | 210.182 |
| 0.6916666666666668 | 210.182 |
| 0.6923611111111111 | 210.182 |
| 0.6930555555555555 | 205.62 |
| 0.69375 | 196.497 |
| 0.6944444444444445 | 191.937 |
| 0.6951388888888889 | 178.264 |
| 0.6958333333333333 | 173.709 |
| 0.6965277777777777 | 191.937 |
| 0.6972222222222223 | 191.937 |
| 0.6979166666666666 | 191.937 |
| 0.6986111111111111 | 191.937 |
| 0.6993055555555556 | 191.937 |
| 0.7000000000000001 | 191.937 |
| 0.7006944444444444 | 196.497 |
| 0.7013888888888888 | 196.497 |
| 0.7020833333333334 | 196.497 |
| 0.7027777777777778 | 196.497 |
| 0.7034722222222222 | 196.497 |
| 0.7041666666666666 | 196.497 |
| 0.7048611111111112 | 187.378 |
| 0.7055555555555556 | 182.82 |
| 0.7062499999999999 | 173.709 |
| 0.7069444444444444 | 169.156 |
| 0.7076388888888889 | 146.423 |
| 0.7083333333333334 | 164.605 |
| 0.7090277777777777 | 169.156 |
| 0.7097222222222223 | 164.605 |
| 0.7104166666666667 | 123.758 |
| 0.7111111111111111 | 123.758 |
| 0.7118055555555555 | 123.758 |
| 0.7125 | 123.758 |
| 0.7131944444444445 | 119.235 |
| 0.7138888888888889 | 119.235 |
| 0.7145833333333332 | 119.235 |
| 0.7152777777777778 | 119.235 |
| 0.7159722222222222 | 123.758 |
| 0.7166666666666667 | 123.758 |
| 0.717361111111111 | 119.235 |
| 0.7180555555555556 | 128.284 |
| 0.71875 | 146.423 |
| 0.7194444444444444 | 146.423 |
| 0.720138888888889 | 141.884 |
| 0.7208333333333333 | 141.884 |
| 0.7215277777777778 | 141.884 |
| 0.7222222222222222 | 137.347 |
| 0.7229166666666668 | 137.347 |
| 0.7236111111111111 | 132.814 |
| 0.7243055555555555 | 132.814 |
| 0.725 | 132.814 |
| 0.7256944444444445 | 132.814 |
| 0.7263888888888889 | 137.347 |
| 0.7270833333333333 | 137.347 |
| 0.7277777777777777 | 141.884 |
| 0.7284722222222223 | 141.884 |
| 0.7291666666666666 | 141.884 |
| 0.7298611111111111 | 141.884 |
| 0.7305555555555556 | 141.884 |
| 0.7312500000000001 | 141.884 |
| 0.7319444444444444 | 141.884 |
| 0.7326388888888888 | 141.884 |
| 0.7333333333333334 | 141.884 |
| 0.7340277777777778 | 141.884 |
| 0.7347222222222222 | 141.884 |
| 0.7354166666666666 | 146.423 |
| 0.7361111111111112 | 146.423 |
| 0.7368055555555556 | 146.423 |
| 0.7374999999999999 | 146.423 |
| 0.7381944444444444 | 146.423 |
| 0.7388888888888889 | 141.884 |
| 0.7395833333333334 | 141.884 |
| 0.7402777777777777 | 137.347 |
| 0.7409722222222223 | 137.347 |
| 0.7416666666666667 | 137.347 |
| 0.7423611111111111 | 137.347 |
| 0.7430555555555555 | 132.814 |
| 0.74375 | 137.347 |
| 0.7444444444444445 | 137.347 |
| 0.7451388888888889 | 132.814 |
| 0.7458333333333332 | 128.284 |
| 0.7465277777777778 | 123.758 |
| 0.7472222222222222 | 119.235 |
| 0.7479166666666667 | 119.235 |
| 0.748611111111111 | 110.201 |
| 0.7493055555555556 | 110.201 |
| 0.75 | 110.201 |
| 0.7506944444444444 | 101.184 |
| 0.751388888888889 | 101.184 |
| 0.7520833333333333 | 96.682 |
| 0.7527777777777778 | 101.184 |
| 0.7534722222222222 | 101.184 |
| 0.7541666666666668 | 96.682 |
| 0.7548611111111111 | 92.184 |
| 0.7555555555555555 | 92.184 |
| 0.75625 | 87.692 |
| 0.7569444444444445 | 83.205 |
| 0.7576388888888889 | 83.205 |
| 0.7583333333333333 | 74.246 |
| 0.7590277777777777 | 74.246 |
| 0.7597222222222223 | 74.246 |
| 0.7604166666666666 | 83.205 |
| 0.7611111111111111 | 83.205 |
| 0.7618055555555556 | 78.722 |
| 0.7625000000000001 | 83.205 |
| 0.7631944444444444 | 83.205 |
| 0.7638888888888888 | 83.205 |
| 0.7645833333333334 | 83.205 |
| 0.7652777777777778 | 83.205 |
| 0.7659722222222222 | 83.205 |
| 0.7666666666666666 | 78.722 |
| 0.7673611111111112 | 78.722 |
| 0.7680555555555556 | 78.722 |
| 0.7687499999999999 | 78.722 |
| 0.7694444444444444 | 78.722 |
| 0.7701388888888889 | 74.246 |
| 0.7708333333333334 | 74.246 |
| 0.7715277777777777 | 74.246 |
| 0.7722222222222223 | 74.246 |
| 0.7729166666666667 | 74.246 |
| 0.7736111111111111 | 74.246 |
| 0.7743055555555555 | 74.246 |
| 0.775 | 69.775 |
| 0.7756944444444445 | 69.775 |
| 0.7763888888888889 | 69.775 |
| 0.7770833333333332 | 65.31 |
| 0.7777777777777778 | 65.31 |
| 0.7784722222222222 | 65.31 |
| 0.7791666666666667 | 65.31 |
| 0.779861111111111 | 65.31 |
| 0.7805555555555556 | 65.31 |
| 0.78125 | 60.85 |
| 0.7819444444444444 | 60.85 |
| 0.782638888888889 | 60.85 |
| 0.7833333333333333 | 60.85 |
| 0.7840277777777778 | 60.85 |
| 0.7847222222222222 | 60.85 |
| 0.7854166666666668 | 60.85 |
| 0.7861111111111111 | 60.85 |
| 0.7868055555555555 | 56.398 |
| 0.7875 | 56.398 |
| 0.7881944444444445 | 56.398 |
| 0.7888888888888889 | 56.398 |
| 0.7895833333333333 | 56.398 |
| 0.7902777777777777 | 51.951 |
| 0.7909722222222223 | 51.951 |
| 0.7916666666666666 | 51.951 |
| 0.7923611111111111 | 51.951 |
| 0.7930555555555556 | 51.951 |
| 0.7937500000000001 | 51.951 |
| 0.7944444444444444 | 51.951 |
| 0.7951388888888888 | 51.951 |
| 0.7958333333333334 | 47.511 |
| 0.7965277777777778 | 47.511 |
| 0.7972222222222222 | 47.511 |
| 0.7979166666666666 | 47.511 |
| 0.7986111111111112 | 47.511 |
| 0.7993055555555556 | 47.511 |
| 0.7999999999999999 | 47.511 |
| 0.8006944444444444 | 47.511 |
| 0.8013888888888889 | 43.079 |
| 0.8020833333333334 | 43.079 |
| 0.8027777777777777 | 43.079 |
| 0.8034722222222223 | 43.079 |
| 0.8041666666666667 | 43.079 |
| 0.8048611111111111 | 43.079 |
| 0.8055555555555555 | 43.079 |
| 0.80625 | 43.079 |
| 0.8069444444444445 | 38.653 |
| 0.8076388888888889 | 38.653 |
| 0.8083333333333332 | 38.653 |
| 0.8090277777777778 | 38.653 |
| 0.8097222222222222 | 38.653 |
| 0.8104166666666667 | 38.653 |
| 0.811111111111111 | 38.653 |
| 0.8118055555555556 | 34.234 |
| 0.8125 | 34.234 |
| 0.8131944444444444 | 34.234 |
| 0.813888888888889 | 34.234 |
| 0.8145833333333333 | 34.234 |
| 0.8152777777777778 | 34.234 |
| 0.8159722222222222 | 34.234 |
| 0.8166666666666668 | 29.823 |
| 0.8173611111111111 | 29.823 |
| 0.8180555555555555 | 29.823 |
| 0.81875 | 29.823 |
| 0.8194444444444445 | 29.823 |
| 0.8201388888888889 | 29.823 |
| 0.8208333333333333 | 29.823 |
| 0.8215277777777777 | 29.823 |
| 0.8222222222222223 | 29.823 |
| 0.8229166666666666 | 29.823 |
| 0.8236111111111111 | 29.823 |
| 0.8243055555555556 | 25.419 |
| 0.8250000000000001 | 25.419 |
| 0.8256944444444444 | 25.419 |
| 0.8263888888888888 | 25.419 |
| 0.8270833333333334 | 25.419 |
| 0.8277777777777778 | 25.419 |
| 0.8284722222222222 | 25.419 |
| 0.8291666666666666 | 21.024 |
| 0.8298611111111112 | 21.024 |
| 0.8305555555555556 | 21.024 |
| 0.8312499999999999 | 21.024 |
| 0.8319444444444444 | 21.024 |
| 0.8326388888888889 | 21.024 |
| 0.8333333333333334 | 21.024 |
| 0.8340277777777777 | 21.024 |
| 0.8347222222222223 | 21.024 |
| 0.8354166666666667 | 21.024 |
| 0.8361111111111111 | 16.636 |
| 0.8368055555555555 | 16.636 |
| 0.8375 | 16.636 |
| 0.8381944444444445 | 16.636 |
| 0.8388888888888889 | 16.636 |
| 0.8395833333333332 | 16.636 |
| 0.8402777777777778 | 16.636 |
| 0.8409722222222222 | 16.636 |
| 0.8416666666666667 | 16.636 |
| 0.842361111111111 | 12.257 |
| 0.8430555555555556 | 12.257 |
| 0.84375 | 12.257 |
| 0.8444444444444444 | 12.257 |
| 0.845138888888889 | 12.257 |
| 0.8458333333333333 | 12.257 |
| 0.8465277777777778 | 12.257 |
| 0.8472222222222222 | 7.887 |
| 0.8479166666666668 | 7.887 |
| 0.8486111111111111 | 7.887 |
| 0.8493055555555555 | 7.887 |
| 0.85 | 7.887 |
| 0.8506944444444445 | 7.887 |
| 0.8513888888888889 | 7.887 |
| 0.8520833333333333 | 7.887 |
| 0.8527777777777777 | 3.525 |
| 0.8534722222222223 | 3.525 |
| 0.8541666666666666 | 3.525 |
| 0.8548611111111111 | 3.525 |
| 0.8555555555555556 | 3.525 |
| 0.8562500000000001 | 3.525 |
| 0.8569444444444444 | 3.525 |
| 0.8576388888888888 | 3.525 |
| 0.8583333333333334 | 3.525 |
| 0.8590277777777778 | 3.525 |
| 0.8597222222222222 | 3.525 |
| 0.8604166666666666 | 3.525 |
| 0.8611111111111112 | 0 |
| 0.8618055555555556 | 0 |
| 0.8624999999999999 | 0 |
| 0.8631944444444444 | 0 |
| 0.8638888888888889 | 0 |
| 0.8645833333333334 | 0 |
| 0.8652777777777777 | 0 |
| 0.8659722222222223 | 0 |
| 0.8666666666666667 | 0 |
| 0.8673611111111111 | 0 |
| 0.8680555555555555 | 0 |
| 0.86875 | 0 |
| 0.8694444444444445 | 0 |
| 0.8701388888888889 | 0 |
| 0.8708333333333332 | 0 |
| 0.8715277777777778 | 0 |
| 0.8722222222222222 | 0 |
| 0.8729166666666667 | 0 |
| 0.873611111111111 | 0 |
| 0.8743055555555556 | 0 |
| 0.875 | 0 |
| 0.8756944444444444 | 0 |
| 0.876388888888889 | 0 |
| 0.8770833333333333 | 0 |
| 0.8777777777777778 | 0 |
| 0.8784722222222222 | 0 |
| 0.8791666666666668 | 0 |
| 0.8798611111111111 | 0 |
| 0.8805555555555555 | 0 |
| 0.88125 | 0 |
| 0.8819444444444445 | 0 |
| 0.8826388888888889 | 0 |
| 0.8833333333333333 | 0 |
| 0.8840277777777777 | 0 |
| 0.8847222222222223 | 0 |
| 0.8854166666666666 | 0 |
| 0.8861111111111111 | 0 |
| 0.8868055555555556 | 0 |
| 0.8875000000000001 | 0 |
| 0.8881944444444444 | 0 |
| 0.8888888888888888 | 0 |
| 0.8895833333333334 | 0 |
| 0.8902777777777778 | 0 |
| 0.8909722222222222 | 0 |
| 0.8916666666666666 | 0 |
| 0.8923611111111112 | 0 |
| 0.8930555555555556 | 0 |
| 0.8937499999999999 | 0 |
| 0.8944444444444444 | 0 |
| 0.8951388888888889 | 0 |
| 0.8958333333333334 | 0 |
| 0.8965277777777777 | 0 |
| 0.8972222222222223 | 0 |
| 0.8979166666666667 | 0 |
| 0.8986111111111111 | 0 |
| 0.8993055555555555 | 0 |
| 0.9 | 0 |
| 0.9006944444444445 | 0 |
| 0.9013888888888889 | 0 |
| 0.9020833333333332 | 0 |
| 0.9027777777777778 | 0 |
| 0.9034722222222222 | 0 |
| 0.9041666666666667 | 0 |
| 0.904861111111111 | 0 |
| 0.9055555555555556 | 0 |
| 0.90625 | 0 |
| 0.9069444444444444 | 0 |
| 0.907638888888889 | 0 |
| 0.9083333333333333 | 0 |
| 0.9090277777777778 | 0 |
| 0.9097222222222222 | 0 |
| 0.9104166666666668 | 0 |
| 0.9111111111111111 | 0 |
| 0.9118055555555555 | 0 |
| 0.9125 | 0 |
| 0.9131944444444445 | 0 |
| 0.9138888888888889 | 0 |
| 0.9145833333333333 | 0 |
| 0.9152777777777777 | 0 |
| 0.9159722222222223 | 0 |
| 0.9166666666666666 | 0 |
| 0.9173611111111111 | 0 |
| 0.9180555555555556 | 0 |
| 0.9187500000000001 | 0 |
| 0.9194444444444444 | 0 |
| 0.9201388888888888 | 0 |
| 0.9208333333333334 | 0 |
| 0.9215277777777778 | 0 |
| 0.9222222222222222 | 0 |
| 0.9229166666666666 | 0 |
| 0.9236111111111112 | 0 |
| 0.9243055555555556 | 0 |
| 0.9249999999999999 | 0 |
| 0.9256944444444444 | 0 |
| 0.9263888888888889 | 0 |
| 0.9270833333333334 | 0 |
| 0.9277777777777777 | 0 |
| 0.9284722222222223 | 0 |
| 0.9291666666666667 | 0 |
| 0.9298611111111111 | 0 |
| 0.9305555555555555 | 0 |
| 0.93125 | 0 |
| 0.9319444444444445 | 0 |
| 0.9326388888888889 | 0 |
| 0.9333333333333332 | 0 |
| 0.9340277777777778 | 0 |
| 0.9347222222222222 | 0 |
| 0.9354166666666667 | 0 |
| 0.936111111111111 | 0 |
| 0.9368055555555556 | 0 |
| 0.9375 | 0 |
| 0.9381944444444444 | 0 |
| 0.938888888888889 | 0 |
| 0.9395833333333333 | 0 |
| 0.9402777777777778 | 0 |
| 0.9409722222222222 | 0 |
| 0.9416666666666668 | 0 |
| 0.9423611111111111 | 0 |
| 0.9430555555555555 | 0 |
| 0.94375 | 0 |
| 0.9444444444444445 | 0 |
| 0.9451388888888889 | 0 |
| 0.9458333333333333 | 0 |
| 0.9465277777777777 | 0 |
| 0.9472222222222223 | 0 |
| 0.9479166666666666 | 0 |
| 0.9486111111111111 | 0 |
| 0.9493055555555556 | 0 |
| 0.9500000000000001 | 0 |
| 0.9506944444444444 | 0 |
| 0.9513888888888888 | 0 |
| 0.9520833333333334 | 0 |
| 0.9527777777777778 | 0 |
| 0.9534722222222222 | 0 |
| 0.9541666666666666 | 0 |
| 0.9548611111111112 | 0 |
| 0.9555555555555556 | 0 |
| 0.9562499999999999 | 0 |
| 0.9569444444444444 | 0 |
| 0.9576388888888889 | 0 |
| 0.9583333333333334 | 0 |
| 0.9590277777777777 | 0 |
| 0.9597222222222223 | 0 |
| 0.9604166666666667 | 0 |
| 0.9611111111111111 | 0 |
| 0.9618055555555555 | 0 |
| 0.9625 | 0 |
| 0.9631944444444445 | 0 |
| 0.9638888888888889 | 0 |
| 0.9645833333333332 | 0 |
| 0.9652777777777778 | 0 |
| 0.9659722222222222 | 0 |
| 0.9666666666666667 | 0 |
| 0.967361111111111 | 0 |
| 0.9680555555555556 | 0 |
| 0.96875 | 0 |
| 0.9694444444444444 | 0 |
| 0.970138888888889 | 0 |
| 0.9708333333333333 | 0 |
| 0.9715277777777778 | 0 |
| 0.9722222222222222 | 0 |
| 0.9729166666666668 | 0 |
| 0.9736111111111111 | 0 |
| 0.9743055555555555 | 0 |
| 0.975 | 0 |
| 0.9756944444444445 | 0 |
| 0.9763888888888889 | 0 |
| 0.9770833333333333 | 0 |
| 0.9777777777777777 | 0 |
| 0.9784722222222223 | 0 |
| 0.9791666666666666 | 0 |
| 0.9798611111111111 | 0 |
| 0.9805555555555556 | 0 |
| 0.9812500000000001 | 0 |
| 0.9819444444444444 | 0 |
| 0.9826388888888888 | 0 |
| 0.9833333333333334 | 0 |
| 0.9840277777777778 | 0 |
| 0.9847222222222222 | 0 |
| 0.9854166666666666 | 0 |
| 0.9861111111111112 | 0 |
| 0.9868055555555556 | 0 |
| 0.9874999999999999 | 0 |
| 0.9881944444444444 | 0 |
| 0.9888888888888889 | 0 |
| 0.9895833333333334 | 0 |
| 0.9902777777777777 | 0 |
| 0.9909722222222223 | 0 |
| 0.9916666666666667 | 0 |
| 0.9923611111111111 | 0 |
| 0.9930555555555555 | 0 |
| 0.99375 | 0 |
| 0.9944444444444445 | 0 |
| 0.9951388888888889 | 0 |
| 0.9958333333333332 | 0 |
| 0.9965277777777778 | 0 |
| 0.9972222222222222 | 0 |
| 0.9979166666666667 | 0 |
| 0.998611111111111 | 0 |
| 0.9993055555555556 | 0 |